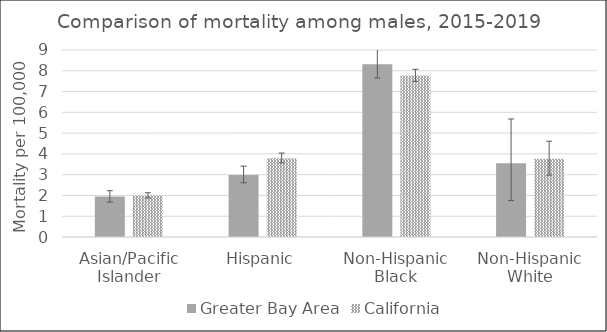
| Category | Greater Bay Area | California | US Mortality |
|---|---|---|---|
| Asian/Pacific Islander | 1.95 | 2 |  |
| Hispanic | 2.98 | 3.79 |  |
| Non-Hispanic Black | 8.32 | 7.77 |  |
| Non-Hispanic White | 3.55 | 3.77 |  |